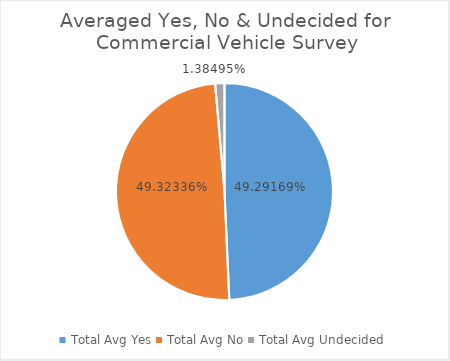
| Category | Series 0 |
|---|---|
| Total Avg Yes | 0.493 |
| Total Avg No | 0.493 |
| Total Avg Undecided | 0.014 |